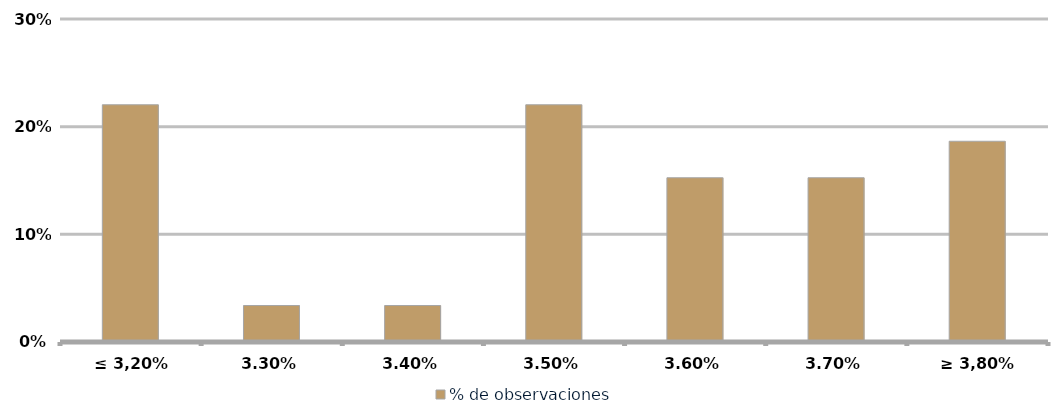
| Category | % de observaciones  |
|---|---|
| ≤ 3,20% | 0.22 |
| 3,30% | 0.034 |
| 3,40% | 0.034 |
| 3,50% | 0.22 |
| 3,60% | 0.153 |
| 3,70% | 0.153 |
| ≥ 3,80% | 0.186 |